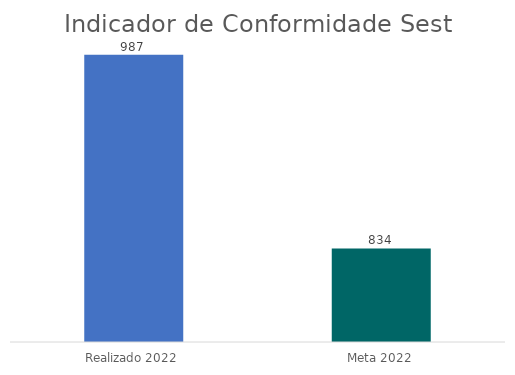
| Category | Series 0 |
|---|---|
| Realizado 2022 | 987 |
| Meta 2022 | 834 |